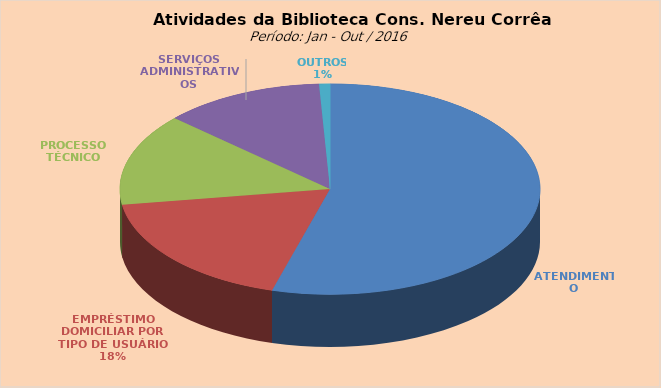
| Category | Series 0 |
|---|---|
| ATENDIMENTO | 15639 |
| EMPRÉSTIMO DOMICILIAR POR TIPO DE USUÁRIO | 5223 |
| PROCESSO TÉCNICO | 4064 |
| SERVIÇOS ADMINISTRATIVOS | 3558 |
| OUTROS | 240 |